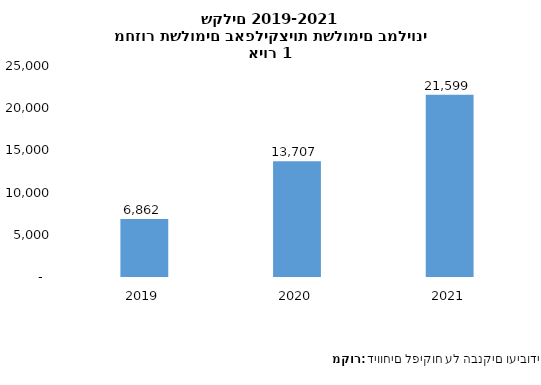
| Category | Series 0 |
|---|---|
| 2019.0 | 6862 |
| 2020.0 | 13707 |
| 2021.0 | 21599 |